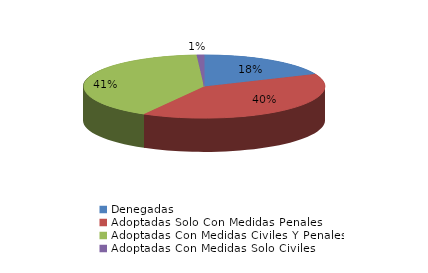
| Category | Series 0 |
|---|---|
| Denegadas | 19 |
| Adoptadas Solo Con Medidas Penales | 41 |
| Adoptadas Con Medidas Civiles Y Penales | 42 |
| Adoptadas Con Medidas Solo Civiles | 1 |